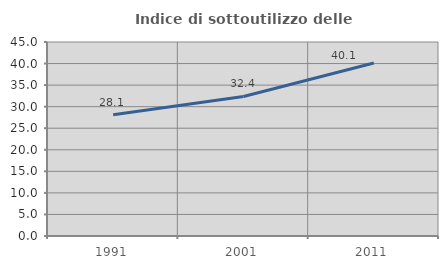
| Category | Indice di sottoutilizzo delle abitazioni  |
|---|---|
| 1991.0 | 28.129 |
| 2001.0 | 32.363 |
| 2011.0 | 40.138 |